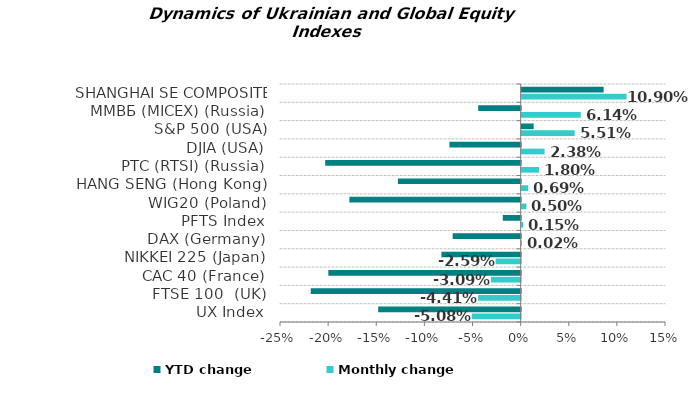
| Category | Monthly change | YTD change |
|---|---|---|
| UX Index | -0.051 | -0.148 |
| FTSE 100  (UK) | -0.044 | -0.218 |
| CAC 40 (France) | -0.031 | -0.2 |
| NIKKEI 225 (Japan) | -0.026 | -0.082 |
| DAX (Germany) | 0 | -0.071 |
| PFTS Index | 0.002 | -0.019 |
| WIG20 (Poland) | 0.005 | -0.178 |
| HANG SENG (Hong Kong) | 0.007 | -0.128 |
| РТС (RTSI) (Russia) | 0.018 | -0.203 |
| DJIA (USA) | 0.024 | -0.074 |
| S&P 500 (USA) | 0.055 | 0.012 |
| ММВБ (MICEX) (Russia) | 0.061 | -0.044 |
| SHANGHAI SE COMPOSITE (China) | 0.109 | 0.085 |